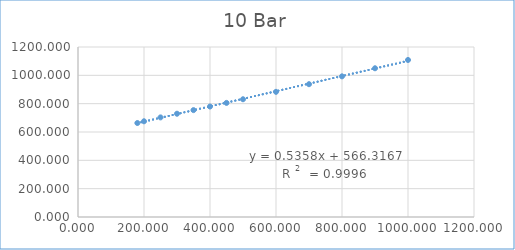
| Category | Series 0 |
|---|---|
| 179.9 | 663.426 |
| 200.0 | 675.657 |
| 250.0 | 703.082 |
| 300.0 | 729.001 |
| 350.0 | 754.467 |
| 400.0 | 779.861 |
| 450.0 | 805.375 |
| 500.0 | 831.128 |
| 600.0 | 883.564 |
| 700.0 | 937.434 |
| 800.0 | 992.857 |
| 900.0 | 1049.881 |
| 1000.0 | 1108.433 |